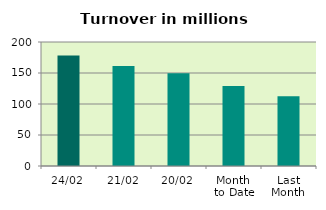
| Category | Series 0 |
|---|---|
| 24/02 | 178.057 |
| 21/02 | 161.177 |
| 20/02 | 149.639 |
| Month 
to Date | 129.228 |
| Last
Month | 112.571 |